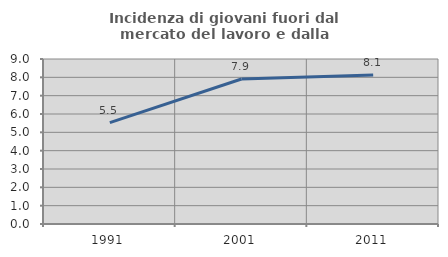
| Category | Incidenza di giovani fuori dal mercato del lavoro e dalla formazione  |
|---|---|
| 1991.0 | 5.526 |
| 2001.0 | 7.91 |
| 2011.0 | 8.125 |